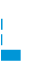
| Category | Series 0 |
|---|---|
| 0 | 0 |
| 1 | 0.027 |
| 2 | 0.016 |
| 3 | 0.957 |